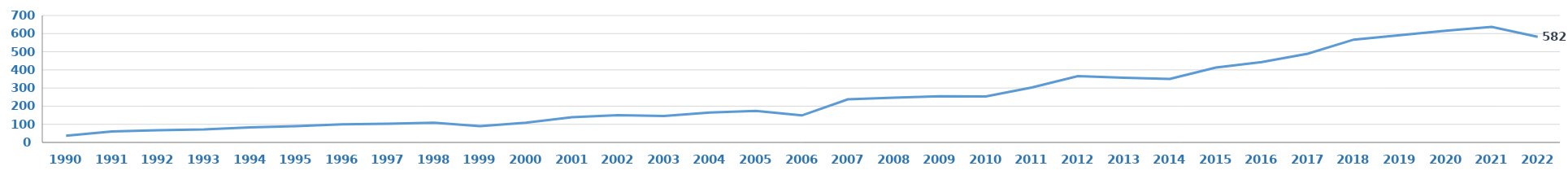
| Category | BTS |
|---|---|
| 1990.0 | 37 |
| 1991.0 | 61 |
| 1992.0 | 67 |
| 1993.0 | 72 |
| 1994.0 | 83 |
| 1995.0 | 90 |
| 1996.0 | 100 |
| 1997.0 | 103 |
| 1998.0 | 109 |
| 1999.0 | 90 |
| 2000.0 | 109 |
| 2001.0 | 139 |
| 2002.0 | 150 |
| 2003.0 | 146 |
| 2004.0 | 165 |
| 2005.0 | 174 |
| 2006.0 | 149 |
| 2007.0 | 238 |
| 2008.0 | 247 |
| 2009.0 | 255 |
| 2010.0 | 254 |
| 2011.0 | 303 |
| 2012.0 | 366 |
| 2013.0 | 357 |
| 2014.0 | 350 |
| 2015.0 | 413 |
| 2016.0 | 443 |
| 2017.0 | 489 |
| 2018.0 | 567 |
| 2019.0 | 591 |
| 2020.0 | 616 |
| 2021.0 | 637 |
| 2022.0 | 582 |